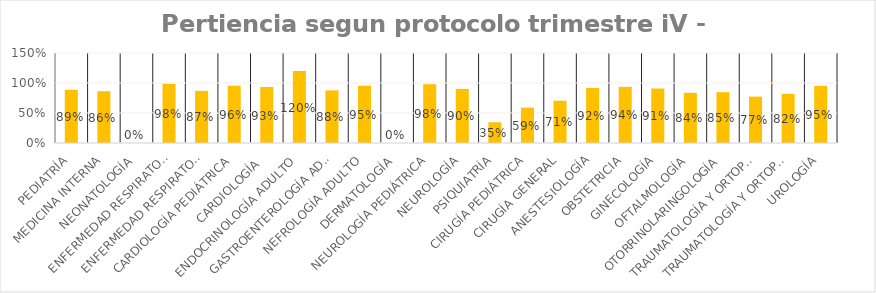
| Category | Series 0 |
|---|---|
| PEDIATRÍA | 0.887 |
| MEDICINA INTERNA | 0.863 |
| NEONATOLOGÍA | 0 |
| ENFERMEDAD RESPIRATORIA PEDIÁTRICA (BRONCOPULMONAR INFANTIL) | 0.985 |
| ENFERMEDAD RESPIRATORIA DE ADULTO (BRONCOPULMONAR) | 0.87 |
| CARDIOLOGÍA PEDIÁTRICA | 0.956 |
| CARDIOLOGÍA  | 0.933 |
| ENDOCRINOLOGÍA ADULTO | 1.2 |
| GASTROENTEROLOGÍA ADULTO | 0.877 |
| NEFROLOGÍA ADULTO | 0.955 |
| DERMATOLOGÍA | 0 |
| NEUROLOGÍA PEDIÁTRICA | 0.98 |
| NEUROLOGÍA | 0.901 |
| PSIQUIATRÍA | 0.345 |
| CIRUGÍA PEDIÁTRICA | 0.589 |
| CIRUGÍA GENERAL | 0.705 |
| ANESTESIOLOGÍA | 0.916 |
| OBSTETRICIA | 0.936 |
| GINECOLOGÍA | 0.908 |
| OFTALMOLOGÍA | 0.837 |
| OTORRINOLARINGOLOGÍA | 0.847 |
| TRAUMATOLOGÍA Y ORTOPEDIA PEDIÁTRICA | 0.773 |
| TRAUMATOLOGÍA Y ORTOPEDIA | 0.82 |
| UROLOGÍA | 0.952 |